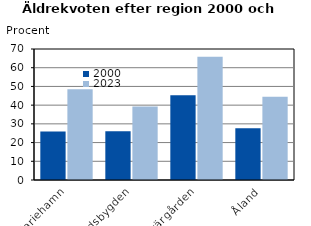
| Category | 2000 | 2023 |
|---|---|---|
| Mariehamn | 25.966 | 48.448 |
| Landsbygden | 26.071 | 39.307 |
| Skärgården | 45.282 | 65.924 |
| Åland | 27.61 | 44.495 |